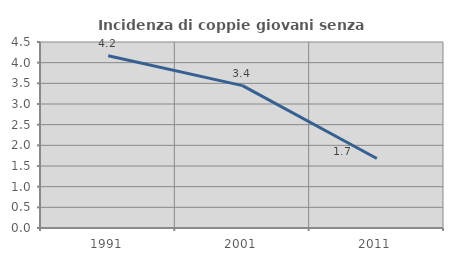
| Category | Incidenza di coppie giovani senza figli |
|---|---|
| 1991.0 | 4.169 |
| 2001.0 | 3.445 |
| 2011.0 | 1.681 |